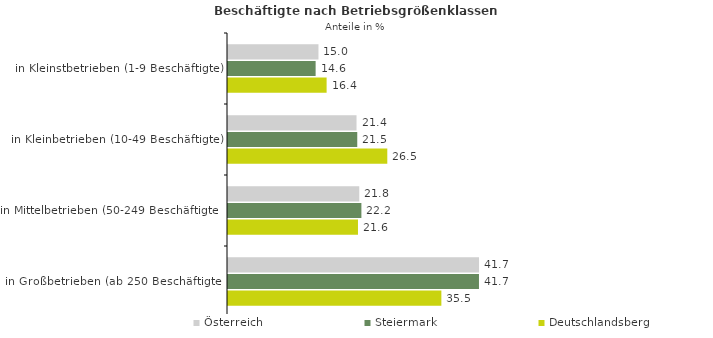
| Category | Österreich | Steiermark | Deutschlandsberg |
|---|---|---|---|
| in Kleinstbetrieben (1-9 Beschäftigte) | 15.046 | 14.574 | 16.401 |
| in Kleinbetrieben (10-49 Beschäftigte) | 21.375 | 21.498 | 26.494 |
| in Mittelbetrieben (50-249 Beschäftigte) | 21.831 | 22.187 | 21.619 |
| in Großbetrieben (ab 250 Beschäftigte) | 41.748 | 41.742 | 35.487 |